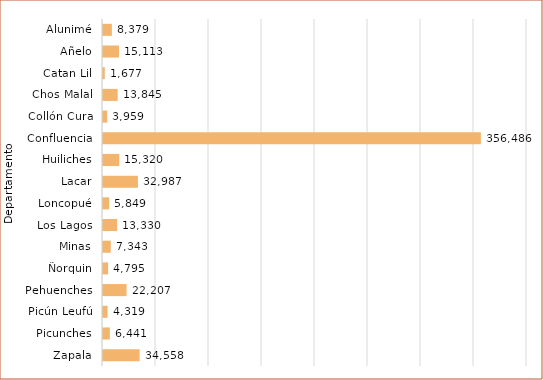
| Category | Series 0 |
|---|---|
| Zapala | 34558 |
| Picunches | 6441 |
| Picún Leufú | 4319 |
| Pehuenches | 22207 |
| Ñorquin | 4795 |
| Minas | 7343 |
| Los Lagos | 13330 |
| Loncopué | 5849 |
| Lacar | 32987 |
| Huiliches | 15320 |
| Confluencia | 356486 |
| Collón Cura | 3959 |
| Chos Malal | 13845 |
| Catan Lil | 1677 |
| Añelo | 15113 |
| Alunimé | 8379 |